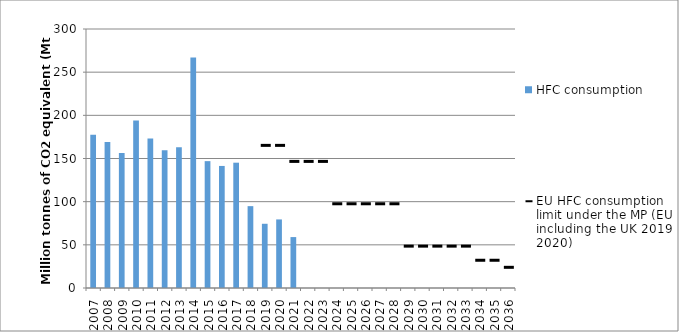
| Category | HFC consumption |
|---|---|
| 2007.0 | 177.516 |
| 2008.0 | 169.254 |
| 2009.0 | 156.355 |
| 2010.0 | 194.002 |
| 2011.0 | 173.175 |
| 2012.0 | 159.418 |
| 2013.0 | 163.12 |
| 2014.0 | 267.023 |
| 2015.0 | 146.947 |
| 2016.0 | 141.373 |
| 2017.0 | 145.148 |
| 2018.0 | 94.812 |
| 2019.0 | 74.393 |
| 2020.0 | 79.428 |
| 2021.0 | 58.978 |
| 2022.0 | 0 |
| 2023.0 | 0 |
| 2024.0 | 0 |
| 2025.0 | 0 |
| 2026.0 | 0 |
| 2027.0 | 0 |
| 2028.0 | 0 |
| 2029.0 | 0 |
| 2030.0 | 0 |
| 2031.0 | 0 |
| 2032.0 | 0 |
| 2033.0 | 0 |
| 2034.0 | 0 |
| 2035.0 | 0 |
| 2036.0 | 0 |